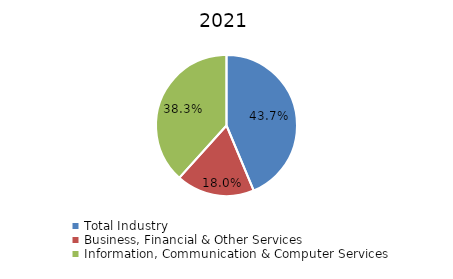
| Category | Series 0 |
|---|---|
| Total Industry | 0.437 |
| Business, Financial & Other Services | 0.18 |
| Information, Communication & Computer Services | 0.383 |